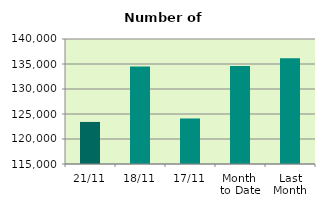
| Category | Series 0 |
|---|---|
| 21/11 | 123412 |
| 18/11 | 134510 |
| 17/11 | 124104 |
| Month 
to Date | 134586.667 |
| Last
Month | 136171.238 |